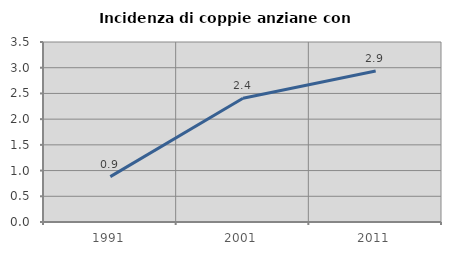
| Category | Incidenza di coppie anziane con figli |
|---|---|
| 1991.0 | 0.882 |
| 2001.0 | 2.407 |
| 2011.0 | 2.936 |